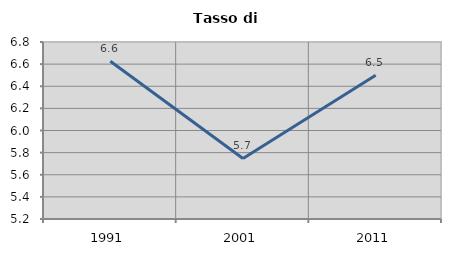
| Category | Tasso di disoccupazione   |
|---|---|
| 1991.0 | 6.627 |
| 2001.0 | 5.747 |
| 2011.0 | 6.5 |